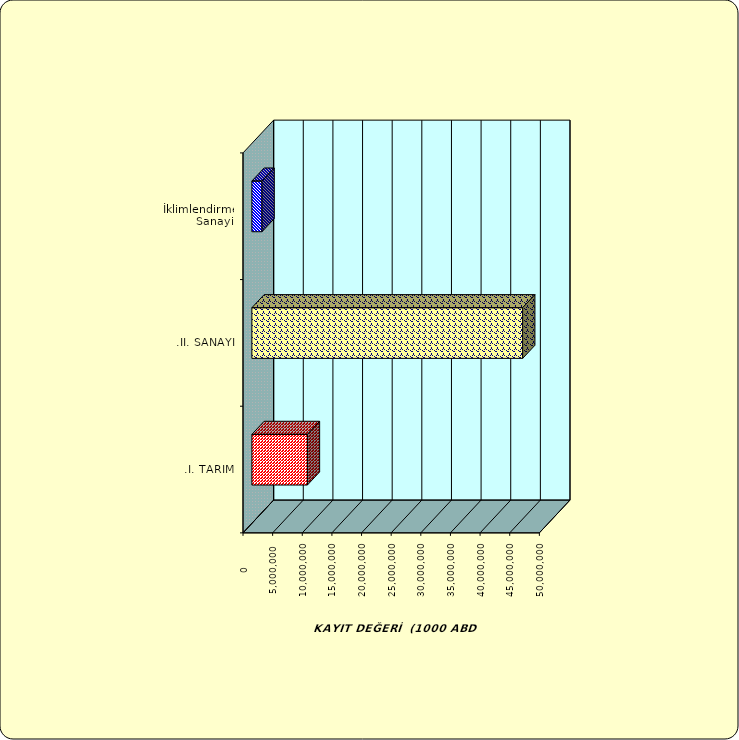
| Category | Series 0 |
|---|---|
| .I. TARIM | 9367594.86 |
| .II. SANAYİ | 45686580.924 |
|  İklimlendirme Sanayii | 1711003.391 |